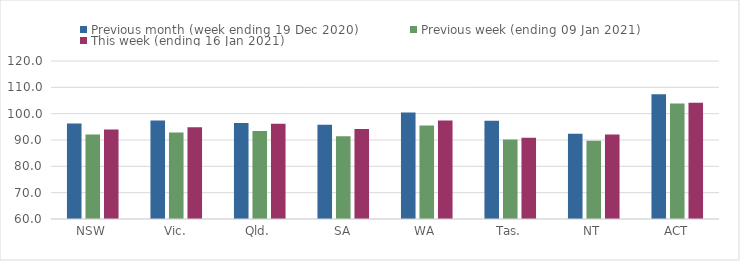
| Category | Previous month (week ending 19 Dec 2020) | Previous week (ending 09 Jan 2021) | This week (ending 16 Jan 2021) |
|---|---|---|---|
| NSW | 96.28 | 92.12 | 93.97 |
| Vic. | 97.41 | 92.86 | 94.85 |
| Qld. | 96.48 | 93.46 | 96.2 |
| SA | 95.79 | 91.45 | 94.17 |
| WA | 100.49 | 95.47 | 97.42 |
| Tas. | 97.29 | 90.17 | 90.86 |
| NT | 92.36 | 89.69 | 92.13 |
| ACT | 107.39 | 103.84 | 104.19 |